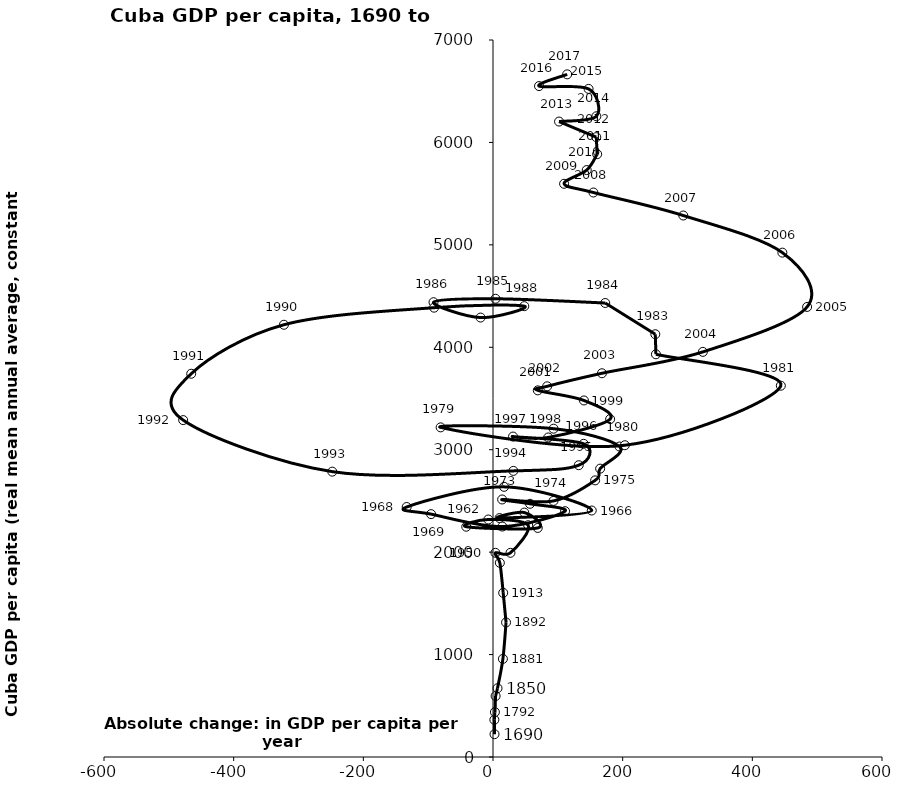
| Category | Series 0 |
|---|---|
| 2.3440292521752784 | 222.64 |
| 2.111508877040896 | 363.281 |
| 2.9364689870307332 | 438.013 |
| 4.026516720240013 | 595.262 |
| 6.976198327861992 | 671.551 |
| 15.28499833917142 | 958.025 |
| 20.142649893000662 | 1313.521 |
| 15.737513638819165 | 1602.589 |
| 10.561807281667408 | 1895.809 |
| 3.7525759245724064 | 1993.376 |
| 26.934712513925525 | 1993.376 |
| 54.23270631416608 | 2262.723 |
| -7.2656257262997315 | 2318.773 |
| -41.25837466005942 | 2248.192 |
| 69.02344439984768 | 2236.256 |
| 48.26451375327679 | 2386.239 |
| 10.119978690203197 | 2332.785 |
| 152.3186536192129 | 2406.479 |
| 17.126117783420796 | 2637.422 |
| -133.11664277113482 | 2440.731 |
| -95.49108097422527 | 2371.189 |
| 14.414428025743973 | 2249.749 |
| 111.13618217729163 | 2400.018 |
| 57.07813150968559 | 2472.021 |
| 14.093323296500557 | 2514.174 |
| 93.3006708810426 | 2500.208 |
| 157.52668641242053 | 2700.775 |
| 165.2534860096605 | 2815.261 |
| 195.03894466781526 | 3031.282 |
| 93.41385783917553 | 3205.339 |
| -80.75507010351066 | 3218.11 |
| 203.40334647223403 | 3043.829 |
| 443.95562521132456 | 3624.917 |
| 251.28494004476465 | 3931.74 |
| 250.34360571256707 | 4127.487 |
| 173.08140137764985 | 4432.428 |
| 3.8379230346067743 | 4473.649 |
| -91.74382297188276 | 4440.104 |
| -19.20450570484627 | 4290.162 |
| 48.27602872977195 | 4401.695 |
| -90.84744324528583 | 4386.714 |
| -322.4885297047356 | 4220 |
| -465.4721539166758 | 3741.737 |
| -477.88243453928226 | 3289.055 |
| -247.91794716543382 | 2785.972 |
| 31.39793458318377 | 2793.219 |
| 132.26111770610532 | 2848.768 |
| 139.82966042891303 | 3057.742 |
| 30.883256721489715 | 3128.427 |
| 85.19985567953086 | 3119.508 |
| 180.6613468789012 | 3298.827 |
| 140.28435672207888 | 3480.831 |
| 69.1122089713815 | 3579.395 |
| 83.52116987541058 | 3619.055 |
| 168.05567815031168 | 3746.438 |
| 323.6961164709844 | 3955.167 |
| 484.4814710658825 | 4393.83 |
| 446.3250732761917 | 4924.13 |
| 293.45867800087353 | 5286.48 |
| 154.82974346752508 | 5511.047 |
| 109.65390501466936 | 5596.14 |
| 144.55747154713845 | 5730.355 |
| 160.66548577480216 | 5885.255 |
| 159.29431919210583 | 6051.686 |
| 101.87020745175187 | 6203.843 |
| 159.4467680517614 | 6255.426 |
| 147.42410596437594 | 6522.737 |
| 70.96075158774602 | 6550.274 |
| 114.38392924059735 | 6664.658 |